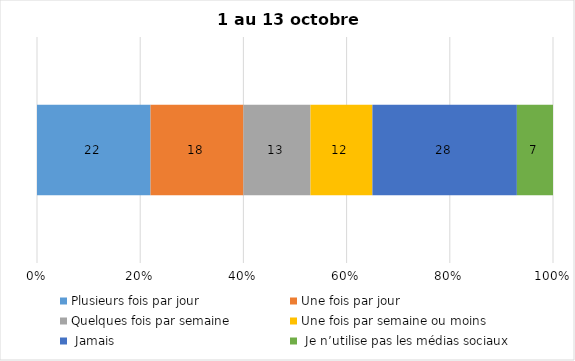
| Category | Plusieurs fois par jour | Une fois par jour | Quelques fois par semaine   | Une fois par semaine ou moins   |  Jamais   |  Je n’utilise pas les médias sociaux |
|---|---|---|---|---|---|---|
| 0 | 22 | 18 | 13 | 12 | 28 | 7 |